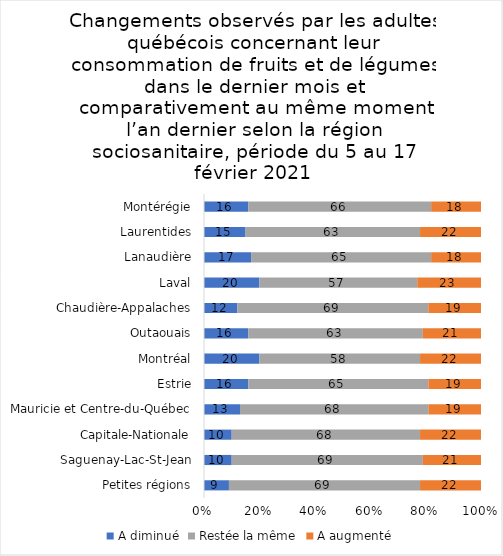
| Category | A diminué | Restée la même | A augmenté |
|---|---|---|---|
| Petites régions | 9 | 69 | 22 |
| Saguenay-Lac-St-Jean | 10 | 69 | 21 |
| Capitale-Nationale | 10 | 68 | 22 |
| Mauricie et Centre-du-Québec | 13 | 68 | 19 |
| Estrie | 16 | 65 | 19 |
| Montréal | 20 | 58 | 22 |
| Outaouais | 16 | 63 | 21 |
| Chaudière-Appalaches | 12 | 69 | 19 |
| Laval | 20 | 57 | 23 |
| Lanaudière | 17 | 65 | 18 |
| Laurentides | 15 | 63 | 22 |
| Montérégie | 16 | 66 | 18 |